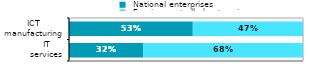
| Category |  National enterprises |  Foreign-controlled enterprises |
|---|---|---|
|  IT 
services | 0.318 | 0.682 |
|  ICT 
manufacturing | 0.529 | 0.471 |